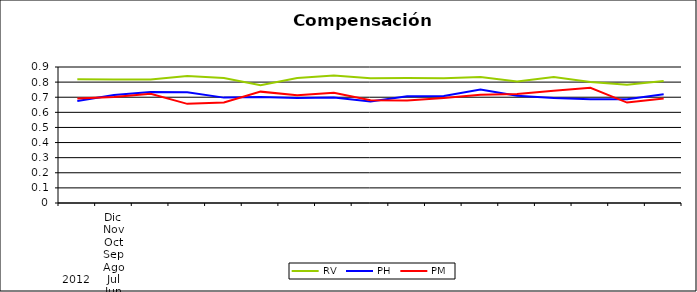
| Category | RV | PH | PM |
|---|---|---|---|
| 0 | 0.819 | 0.675 | 0.691 |
| 1 | 0.818 | 0.714 | 0.701 |
| 2 | 0.817 | 0.734 | 0.722 |
| 3 | 0.84 | 0.732 | 0.656 |
| 4 | 0.827 | 0.697 | 0.666 |
| 5 | 0.78 | 0.701 | 0.737 |
| 6 | 0.827 | 0.695 | 0.713 |
| 7 | 0.844 | 0.699 | 0.73 |
| 8 | 0.826 | 0.672 | 0.68 |
| 9 | 0.827 | 0.706 | 0.678 |
| 10 | 0.826 | 0.709 | 0.696 |
| 11 | 0.834 | 0.751 | 0.717 |
| 12 | 0.804 | 0.709 | 0.721 |
| 13 | 0.834 | 0.694 | 0.743 |
| 14 | 0.802 | 0.687 | 0.763 |
| 15 | 0.783 | 0.687 | 0.665 |
| 16 | 0.807 | 0.72 | 0.692 |